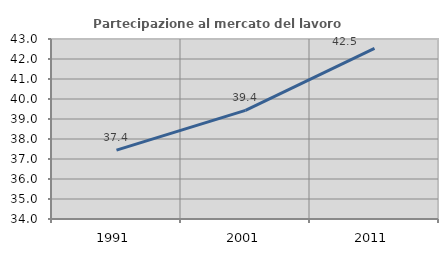
| Category | Partecipazione al mercato del lavoro  femminile |
|---|---|
| 1991.0 | 37.441 |
| 2001.0 | 39.429 |
| 2011.0 | 42.533 |